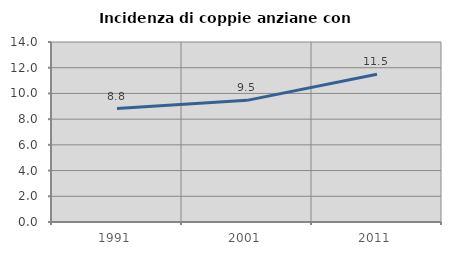
| Category | Incidenza di coppie anziane con figli |
|---|---|
| 1991.0 | 8.819 |
| 2001.0 | 9.462 |
| 2011.0 | 11.496 |